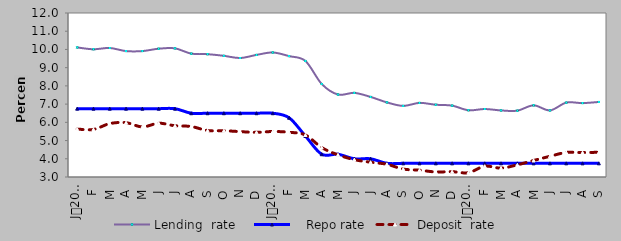
| Category | Lending  |    Repo rate | Deposit  |
|---|---|---|---|
| 0 | 10.11 | 6.75 | 5.63 |
| 1900-01-01 | 10.01 | 6.75 | 5.61 |
| 1900-01-02 | 10.08 | 6.75 | 5.93 |
| 1900-01-03 | 9.91 | 6.75 | 5.98 |
| 1900-01-04 | 9.91 | 6.75 | 5.75 |
| 1900-01-05 | 10.04 | 6.75 | 5.95 |
| 1900-01-06 | 10.06 | 6.75 | 5.813 |
| 1900-01-07 | 9.77 | 6.5 | 5.77 |
| 1900-01-08 | 9.74 | 6.5 | 5.55 |
| 1900-01-09 | 9.65 | 6.5 | 5.54 |
| 1900-01-10 | 9.53 | 6.5 | 5.49 |
| 1900-01-11 | 9.7 | 6.5 | 5.45 |
| 1900-01-12 | 9.833 | 6.5 | 5.497 |
| 1900-01-13 | 9.634 | 6.25 | 5.454 |
| 1900-01-14 | 9.369 | 5.25 | 5.304 |
| 1900-01-15 | 8.106 | 4.25 | 4.617 |
| 1900-01-16 | 7.526 | 4.25 | 4.216 |
| 1900-01-17 | 7.616 | 4 | 3.953 |
| 1900-01-18 | 7.394 | 4 | 3.809 |
| 1900-01-19 | 7.095 | 3.75 | 3.699 |
| 1900-01-20 | 6.902 | 3.75 | 3.437 |
| 1900-01-21 | 7.067 | 3.75 | 3.374 |
| 1900-01-22 | 6.965 | 3.75 | 3.276 |
| 1900-01-23 | 6.917 | 3.75 | 3.292 |
| 1900-01-24 | 6.663 | 3.75 | 3.236 |
| 1900-01-25 | 6.731 | 3.75 | 3.592 |
| 1900-01-26 | 6.653 | 3.75 | 3.488 |
| 1900-01-27 | 6.64 | 3.75 | 3.667 |
| 1900-01-28 | 6.933 | 3.75 | 3.907 |
| 1900-01-29 | 6.654 | 3.75 | 4.137 |
| 1900-01-30 | 7.081 | 3.75 | 4.347 |
| 1900-01-31 | 7.055 | 3.75 | 4.341 |
| 1900-02-01 | 7.118 | 3.75 | 4.357 |